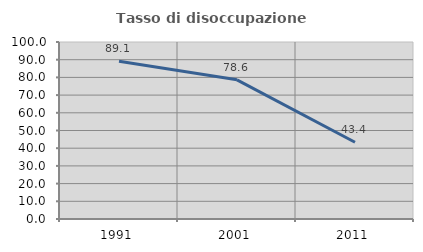
| Category | Tasso di disoccupazione giovanile  |
|---|---|
| 1991.0 | 89.086 |
| 2001.0 | 78.626 |
| 2011.0 | 43.373 |